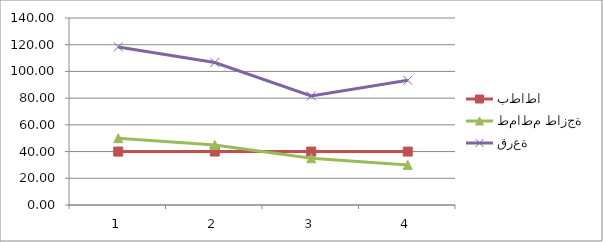
| Category | بطاطا | طماطم طازجة | قرعة |
|---|---|---|---|
| 0 | 40 | 50 | 118.33 |
| 1 | 40 | 45 | 106.67 |
| 2 | 40 | 35 | 81.67 |
| 3 | 40 | 30 | 93.33 |